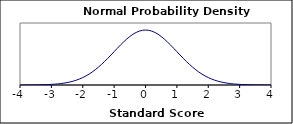
| Category | Series 0 |
|---|---|
| -4.0 | 0 |
| -3.9 | 0 |
| -3.8 | 0 |
| -3.7 | 0 |
| -3.6 | 0.001 |
| -3.5 | 0.001 |
| -3.4 | 0.001 |
| -3.3 | 0.002 |
| -3.2 | 0.002 |
| -3.1 | 0.003 |
| -3.0 | 0.004 |
| -2.9 | 0.006 |
| -2.8 | 0.008 |
| -2.7 | 0.01 |
| -2.6 | 0.014 |
| -2.5 | 0.018 |
| -2.4 | 0.022 |
| -2.3 | 0.028 |
| -2.2 | 0.035 |
| -2.1 | 0.044 |
| -2.0 | 0.054 |
| -1.9 | 0.066 |
| -1.8 | 0.079 |
| -1.7 | 0.094 |
| -1.6 | 0.111 |
| -1.5 | 0.13 |
| -1.4 | 0.15 |
| -1.3 | 0.171 |
| -1.2 | 0.194 |
| -1.1 | 0.218 |
| -1.0 | 0.242 |
| -0.9 | 0.266 |
| -0.8 | 0.29 |
| -0.7 | 0.312 |
| -0.6 | 0.333 |
| -0.5 | 0.352 |
| -0.4 | 0.368 |
| -0.3 | 0.381 |
| -0.2 | 0.391 |
| -0.1 | 0.397 |
| 0.0 | 0.399 |
| 0.0999999999999996 | 0.397 |
| 0.2 | 0.391 |
| 0.3 | 0.381 |
| 0.4 | 0.368 |
| 0.5 | 0.352 |
| 0.6 | 0.333 |
| 0.7 | 0.312 |
| 0.8 | 0.29 |
| 0.9 | 0.266 |
| 1.0 | 0.242 |
| 1.1 | 0.218 |
| 1.2 | 0.194 |
| 1.3 | 0.171 |
| 1.4 | 0.15 |
| 1.50000000000001 | 0.13 |
| 1.6 | 0.111 |
| 1.7 | 0.094 |
| 1.80000000000001 | 0.079 |
| 1.90000000000001 | 0.066 |
| 2.00000000000001 | 0.054 |
| 2.1 | 0.044 |
| 2.20000000000001 | 0.035 |
| 2.30000000000001 | 0.028 |
| 2.40000000000001 | 0.022 |
| 2.50000000000001 | 0.018 |
| 2.60000000000001 | 0.014 |
| 2.70000000000001 | 0.01 |
| 2.80000000000001 | 0.008 |
| 2.90000000000001 | 0.006 |
| 3.00000000000001 | 0.004 |
| 3.10000000000001 | 0.003 |
| 3.20000000000001 | 0.002 |
| 3.30000000000001 | 0.002 |
| 3.40000000000001 | 0.001 |
| 3.50000000000001 | 0.001 |
| 3.60000000000001 | 0.001 |
| 3.70000000000001 | 0 |
| 3.80000000000001 | 0 |
| 3.90000000000001 | 0 |
| 4.00000000000001 | 0 |